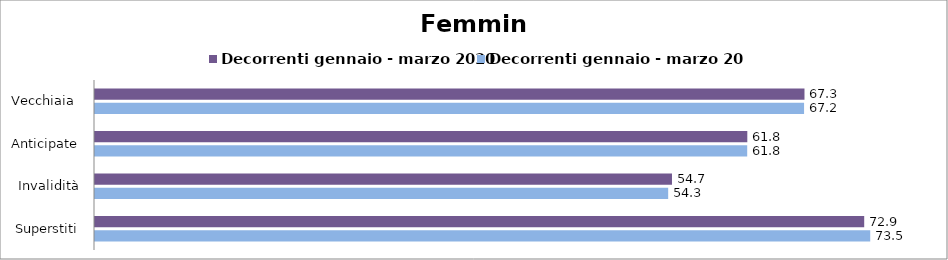
| Category | Decorrenti gennaio - marzo 2020 | Decorrenti gennaio - marzo 2021 |
|---|---|---|
| Vecchiaia  | 67.25 | 67.21 |
| Anticipate | 61.83 | 61.82 |
| Invalidità | 54.69 | 54.33 |
| Superstiti | 72.91 | 73.48 |